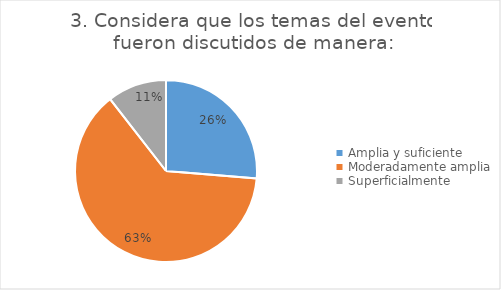
| Category | Series 0 |
|---|---|
| Amplia y suficiente | 5 |
| Moderadamente amplia | 12 |
| Superficialmente | 2 |